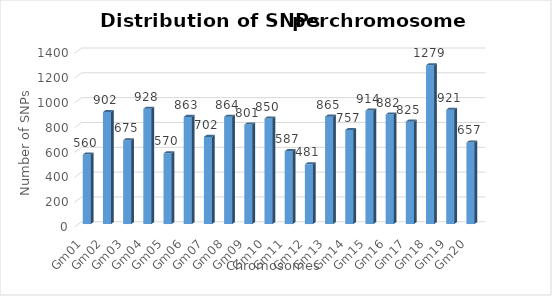
| Category | #SNPs |
|---|---|
| Gm01 | 560 |
| Gm02 | 902 |
| Gm03 | 675 |
| Gm04 | 928 |
| Gm05 | 570 |
| Gm06 | 863 |
| Gm07 | 702 |
| Gm08 | 864 |
| Gm09 | 801 |
| Gm10 | 850 |
| Gm11 | 587 |
| Gm12 | 481 |
| Gm13 | 865 |
| Gm14 | 757 |
| Gm15 | 914 |
| Gm16 | 882 |
| Gm17 | 825 |
| Gm18 | 1279 |
| Gm19 | 921 |
| Gm20 | 657 |